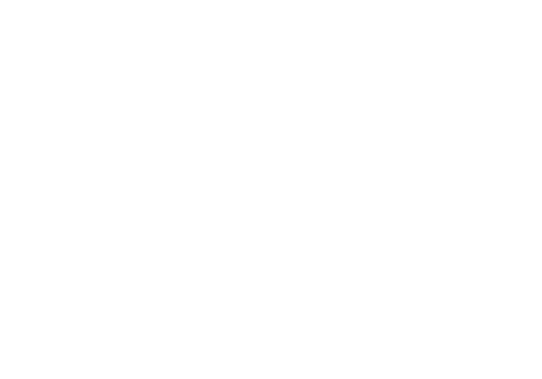
| Category | Series 0 |
|---|---|
| I N C O M E | 0 |
| S A V I N G S | 0 |
| E X P E N S E S | 0 |